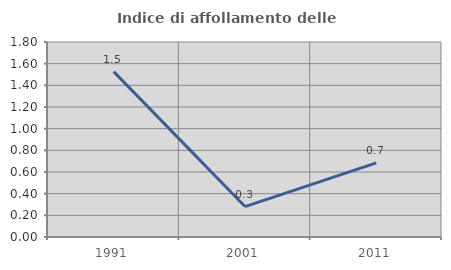
| Category | Indice di affollamento delle abitazioni  |
|---|---|
| 1991.0 | 1.527 |
| 2001.0 | 0.281 |
| 2011.0 | 0.685 |